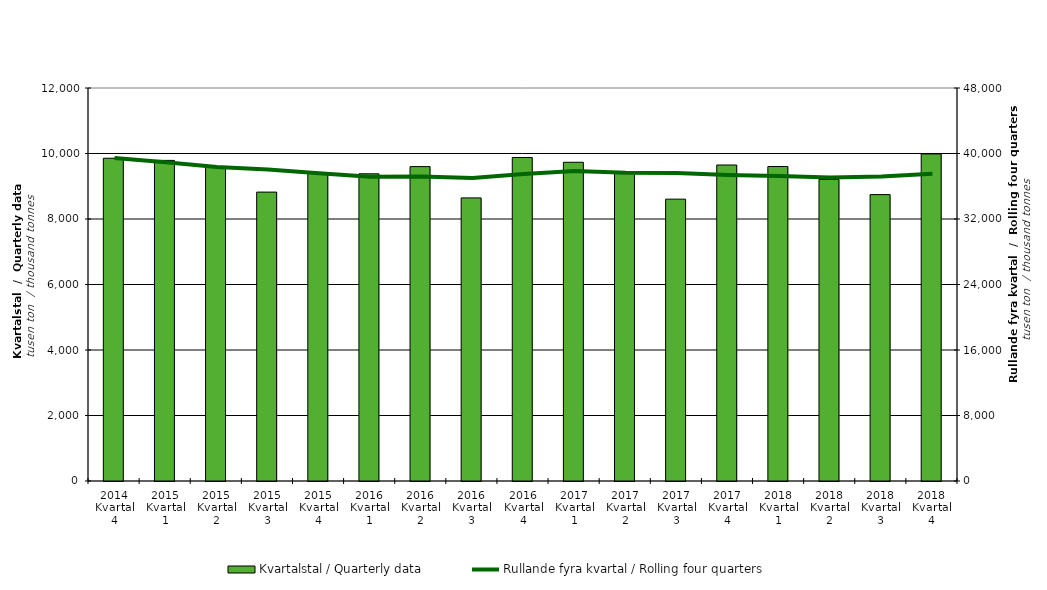
| Category | Kvartalstal / Quarterly data |
|---|---|
| 2014 Kvartal 4 | 9854.974 |
| 2015 Kvartal 1 | 9789.197 |
| 2015 Kvartal 2 | 9575.074 |
| 2015 Kvartal 3 | 8821.293 |
| 2015 Kvartal 4 | 9393.444 |
| 2016 Kvartal 1 | 9380.116 |
| 2016 Kvartal 2 | 9599.604 |
| 2016 Kvartal 3 | 8644.131 |
| 2016 Kvartal 4 | 9877.426 |
| 2017 Kvartal 1 | 9731.963 |
| 2017 Kvartal 2 | 9388.509 |
| 2017 Kvartal 3 | 8606.047 |
| 2017 Kvartal 4 | 9648.61 |
| 2018 Kvartal 1 | 9602.504 |
| 2018 Kvartal 2 | 9205.703 |
| 2018 Kvartal 3 | 8745.169 |
| 2018 Kvartal 4 | 9986.773 |